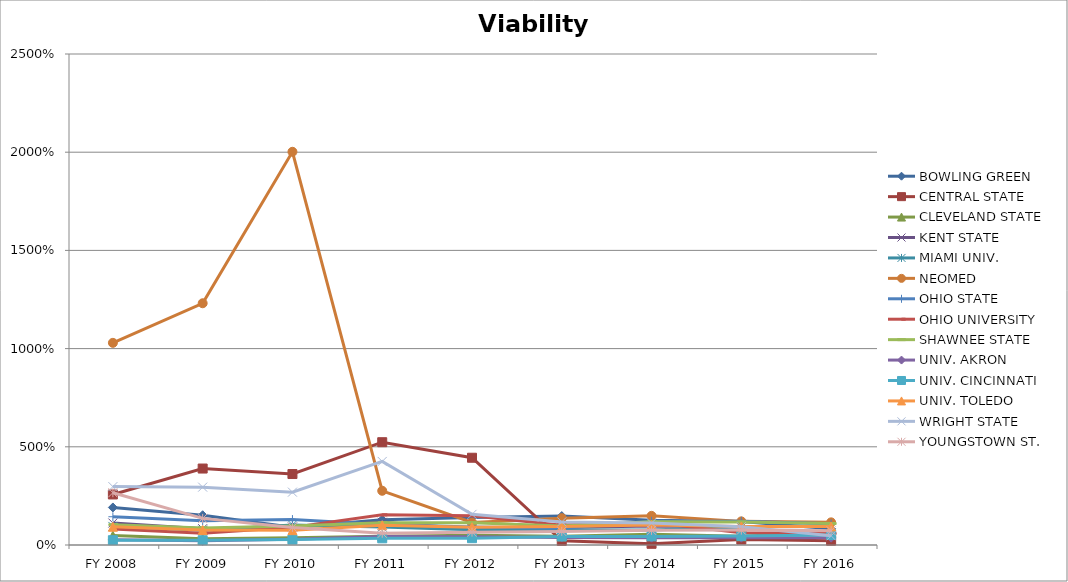
| Category | BOWLING GREEN  | CENTRAL STATE  | CLEVELAND STATE  | KENT STATE  | MIAMI UNIV.  | NEOMED  | OHIO STATE  | OHIO UNIVERSITY  | SHAWNEE STATE  | UNIV. AKRON  | UNIV. CINCINNATI  | UNIV. TOLEDO  | WRIGHT STATE  | YOUNGSTOWN ST.  |
|---|---|---|---|---|---|---|---|---|---|---|---|---|---|---|
| FY 2016 | 0.823 | 0.22 | 0.653 | 0.936 | 0.976 | 1.153 | 1.08 | 0.587 | 1.094 | 0.374 | 0.509 | 0.94 | 0.47 | 0.725 |
| FY 2015 | 1.191 | 0.28 | 0.447 | 0.931 | 0.915 | 1.203 | 1.212 | 0.63 | 1.175 | 0.372 | 0.453 | 0.944 | 0.931 | 0.758 |
| FY 2014 | 1.258 | 0.061 | 0.542 | 0.967 | 0.768 | 1.484 | 1.207 | 1.139 | 1.188 | 0.373 | 0.438 | 1.024 | 1.116 | 0.747 |
| FY 2013 | 1.473 | 0.212 | 0.441 | 0.896 | 0.758 | 1.366 | 0.857 | 1.012 | 0.964 | 0.388 | 0.433 | 0.944 | 1.177 | 0.693 |
| FY 2012 | 1.406 | 4.443 | 0.499 | 0.817 | 0.775 | 1.144 | 0.917 | 1.495 | 1.129 | 0.417 | 0.347 | 0.904 | 1.561 | 0.654 |
| FY 2011 | 1.291 | 5.234 | 0.44 | 1.156 | 0.912 | 2.76 | 1.041 | 1.534 | 1.139 | 0.438 | 0.341 | 1.007 | 4.254 | 0.598 |
| FY 2010 | 0.907 | 3.614 | 0.375 | 0.918 | 1.022 | 20.021 | 1.294 | 0.898 | 0.967 | 0.298 | 0.278 | 0.756 | 2.691 | 0.896 |
| FY 2009 | 1.515 | 3.893 | 0.317 | 0.831 | 0.752 | 12.309 | 1.24 | 0.603 | 0.87 | 0.214 | 0.243 | 0.76 | 2.946 | 1.355 |
| FY 2008 | 1.911 | 2.574 | 0.48 | 1.119 | 0.946 | 10.293 | 1.439 | 0.813 | 1.035 | 0.273 | 0.245 | 0.929 | 2.973 | 2.662 |